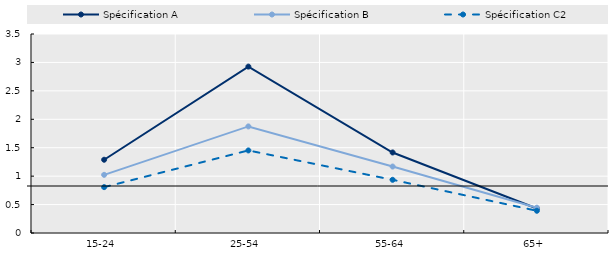
| Category | Spécification A | Spécification B | Spécification C2 |
|---|---|---|---|
| 15-24 | 1.288 | 1.023 | 0.807 |
| 25-54 | 2.926 | 1.874 | 1.452 |
| 55-64 | 1.416 | 1.169 | 0.936 |
| 65+ | 0.43 | 0.445 | 0.391 |